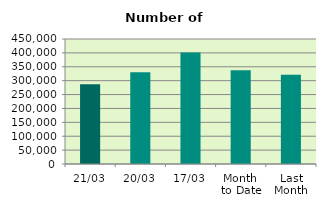
| Category | Series 0 |
|---|---|
| 21/03 | 287062 |
| 20/03 | 330536 |
| 17/03 | 401304 |
| Month 
to Date | 337164.8 |
| Last
Month | 321374.6 |